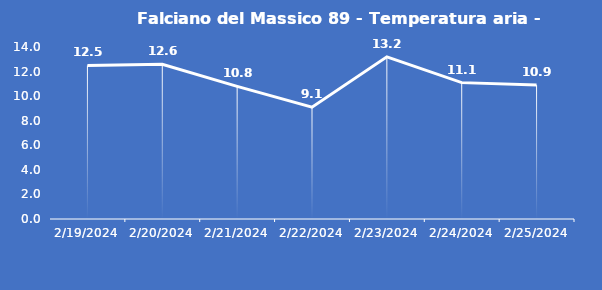
| Category | Falciano del Massico 89 - Temperatura aria - Grezzo (°C) |
|---|---|
| 2/19/24 | 12.5 |
| 2/20/24 | 12.6 |
| 2/21/24 | 10.8 |
| 2/22/24 | 9.1 |
| 2/23/24 | 13.2 |
| 2/24/24 | 11.1 |
| 2/25/24 | 10.9 |